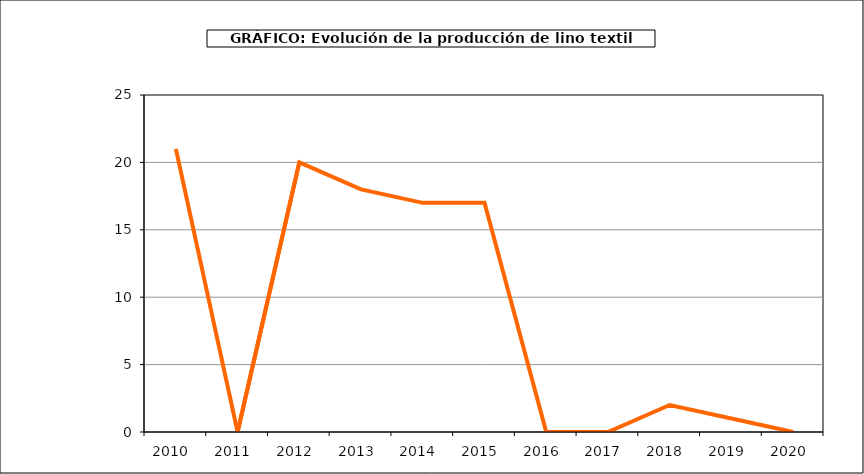
| Category | producción |
|---|---|
| 2010.0 | 21 |
| 2011.0 | 0 |
| 2012.0 | 20 |
| 2013.0 | 18 |
| 2014.0 | 17 |
| 2015.0 | 17 |
| 2016.0 | 0 |
| 2017.0 | 0 |
| 2018.0 | 2 |
| 2019.0 | 1 |
| 2020.0 | 0 |